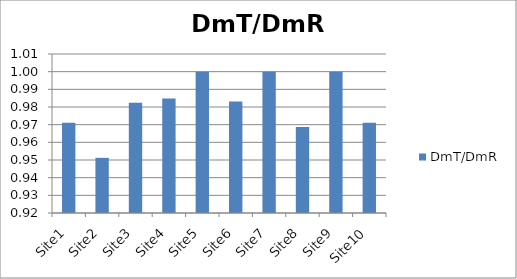
| Category | DmT/DmR |
|---|---|
| Site1 | 0.971 |
| Site2 | 0.951 |
| Site3 | 0.982 |
| Site4 | 0.985 |
| Site5 | 1 |
| Site6 | 0.983 |
| Site7 | 1 |
| Site8 | 0.969 |
| Site9 | 1 |
| Site10 | 0.971 |